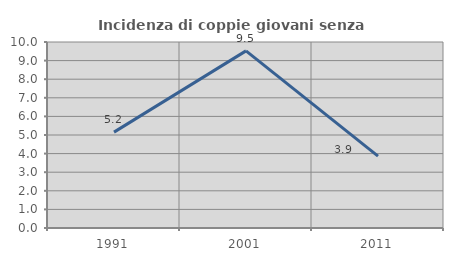
| Category | Incidenza di coppie giovani senza figli |
|---|---|
| 1991.0 | 5.155 |
| 2001.0 | 9.524 |
| 2011.0 | 3.863 |